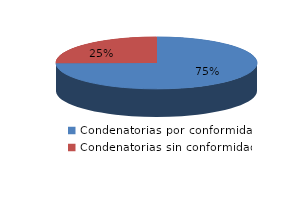
| Category | Series 0 |
|---|---|
| 0 | 208 |
| 1 | 70 |